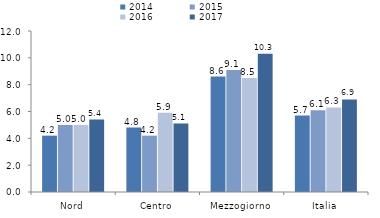
| Category | 2014 | 2015 | 2016 | 2017 |
|---|---|---|---|---|
| Nord | 4.2 | 5 | 5 | 5.4 |
| Centro | 4.8 | 4.2 | 5.9 | 5.1 |
| Mezzogiorno | 8.6 | 9.1 | 8.5 | 10.3 |
| Italia | 5.7 | 6.1 | 6.3 | 6.9 |